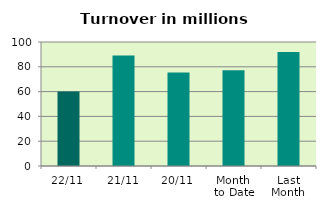
| Category | Series 0 |
|---|---|
| 22/11 | 59.984 |
| 21/11 | 89.147 |
| 20/11 | 75.495 |
| Month 
to Date | 77.205 |
| Last
Month | 91.964 |